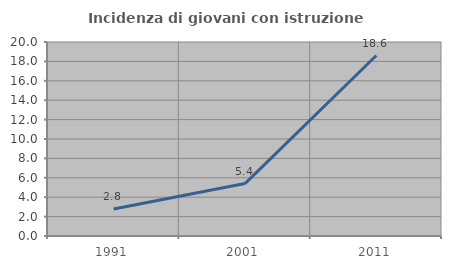
| Category | Incidenza di giovani con istruzione universitaria |
|---|---|
| 1991.0 | 2.778 |
| 2001.0 | 5.405 |
| 2011.0 | 18.605 |